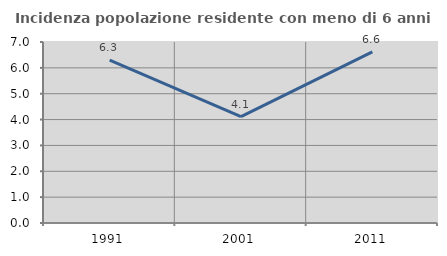
| Category | Incidenza popolazione residente con meno di 6 anni |
|---|---|
| 1991.0 | 6.296 |
| 2001.0 | 4.114 |
| 2011.0 | 6.616 |